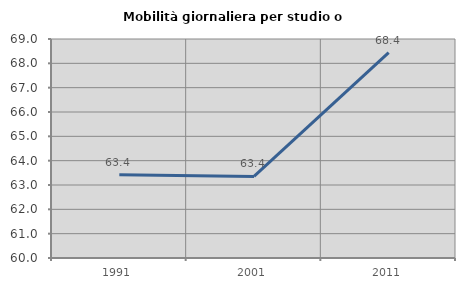
| Category | Mobilità giornaliera per studio o lavoro |
|---|---|
| 1991.0 | 63.419 |
| 2001.0 | 63.353 |
| 2011.0 | 68.439 |